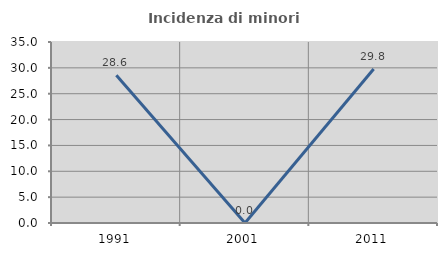
| Category | Incidenza di minori stranieri |
|---|---|
| 1991.0 | 28.571 |
| 2001.0 | 0 |
| 2011.0 | 29.787 |